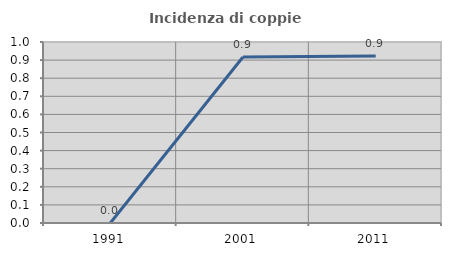
| Category | Incidenza di coppie miste |
|---|---|
| 1991.0 | 0 |
| 2001.0 | 0.917 |
| 2011.0 | 0.923 |